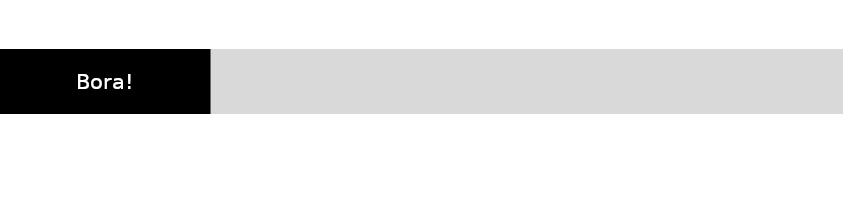
| Category | Series 0 | Series 1 |
|---|---|---|
|  | 0.25 | 0.75 |